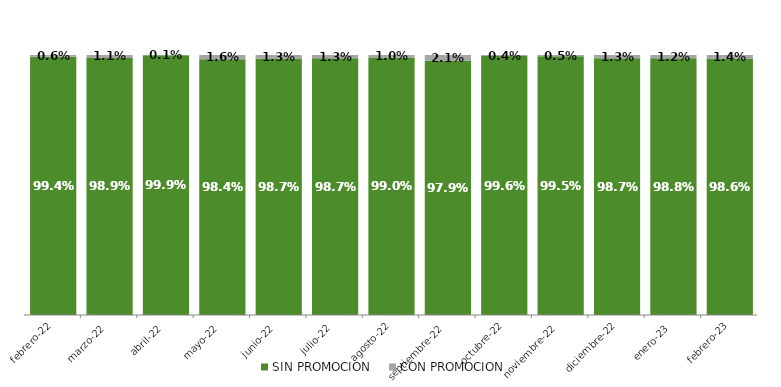
| Category | SIN PROMOCION   | CON PROMOCION   |
|---|---|---|
| 2022-02-01 | 0.994 | 0.006 |
| 2022-03-01 | 0.989 | 0.011 |
| 2022-04-01 | 0.999 | 0.001 |
| 2022-05-01 | 0.984 | 0.016 |
| 2022-06-01 | 0.987 | 0.013 |
| 2022-07-01 | 0.987 | 0.013 |
| 2022-08-01 | 0.99 | 0.01 |
| 2022-09-01 | 0.979 | 0.021 |
| 2022-10-01 | 0.996 | 0.004 |
| 2022-11-01 | 0.995 | 0.005 |
| 2022-12-01 | 0.987 | 0.013 |
| 2023-01-01 | 0.988 | 0.012 |
| 2023-02-01 | 0.986 | 0.014 |